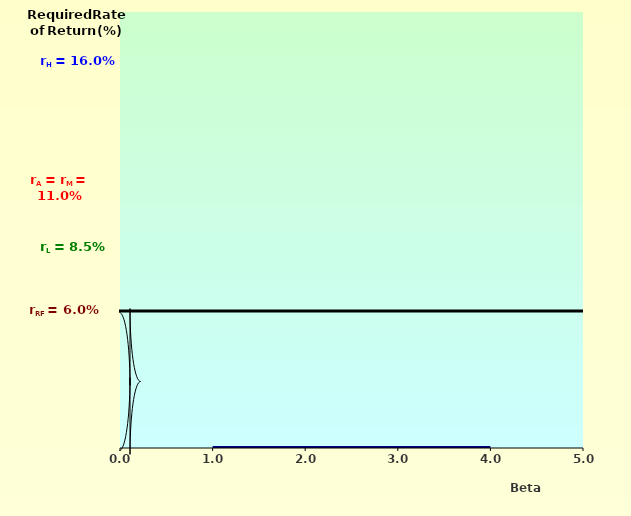
| Category | SML: rRF + RPM*bi |
|---|---|
| 0 | 0 |
| 1 | 0 |
| 2 | 0 |
| 3 | 0 |